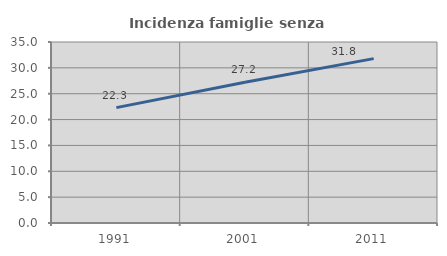
| Category | Incidenza famiglie senza nuclei |
|---|---|
| 1991.0 | 22.315 |
| 2001.0 | 27.209 |
| 2011.0 | 31.783 |